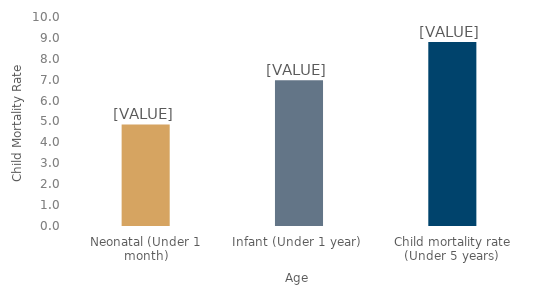
| Category | Series 0 |
|---|---|
| Neonatal (Under 1 month) | 4.858 |
| Infant (Under 1 year)  | 6.972 |
| Child mortality rate (Under 5 years)  | 8.809 |